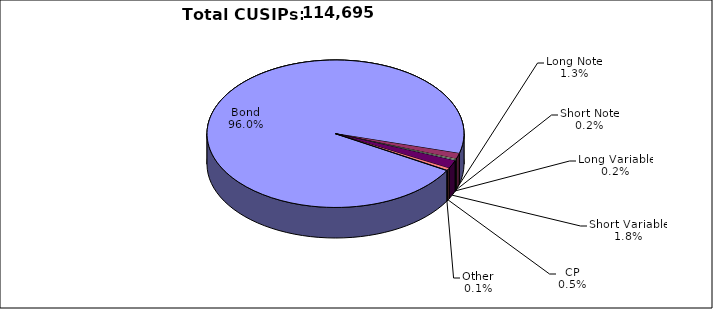
| Category | CUSIPs |
|---|---|
| Bond | 110084 |
| Long Note | 1452 |
| Short Note | 219 |
| Long Variable | 242 |
| Short Variable | 2064 |
| CP | 549 |
| Other | 85 |